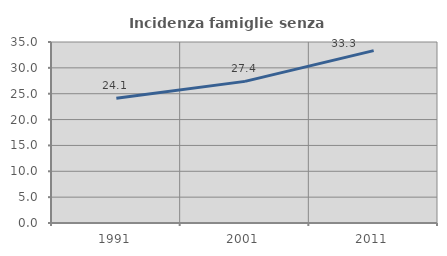
| Category | Incidenza famiglie senza nuclei |
|---|---|
| 1991.0 | 24.138 |
| 2001.0 | 27.386 |
| 2011.0 | 33.333 |